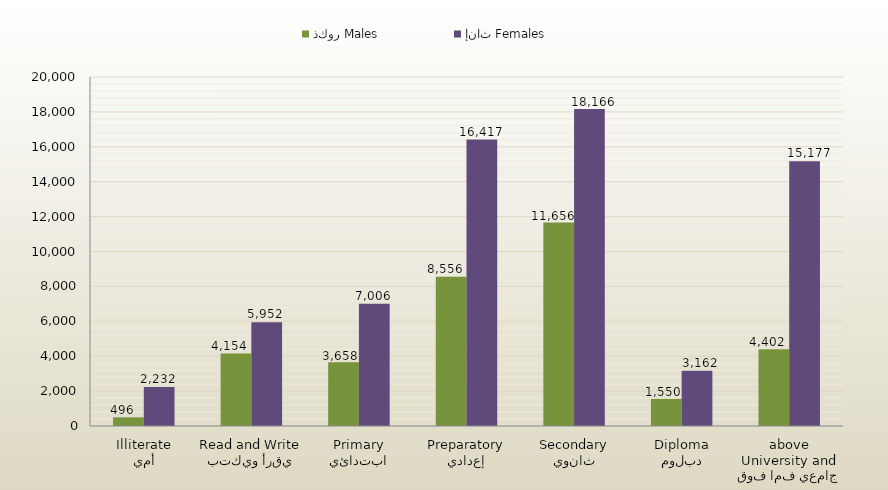
| Category | ذكور Males | إناث Females |
|---|---|---|
| أمي
Illiterate | 496 | 2232 |
| يقرأ ويكتب
Read and Write | 4154 | 5952 |
| ابتدائي
Primary | 3658 | 7006 |
| إعدادي
Preparatory | 8556 | 16417 |
| ثانوي
Secondary | 11656 | 18166 |
| دبلوم
Diploma | 1550 | 3162 |
| جامعي فما فوق
University and above | 4402 | 15177 |